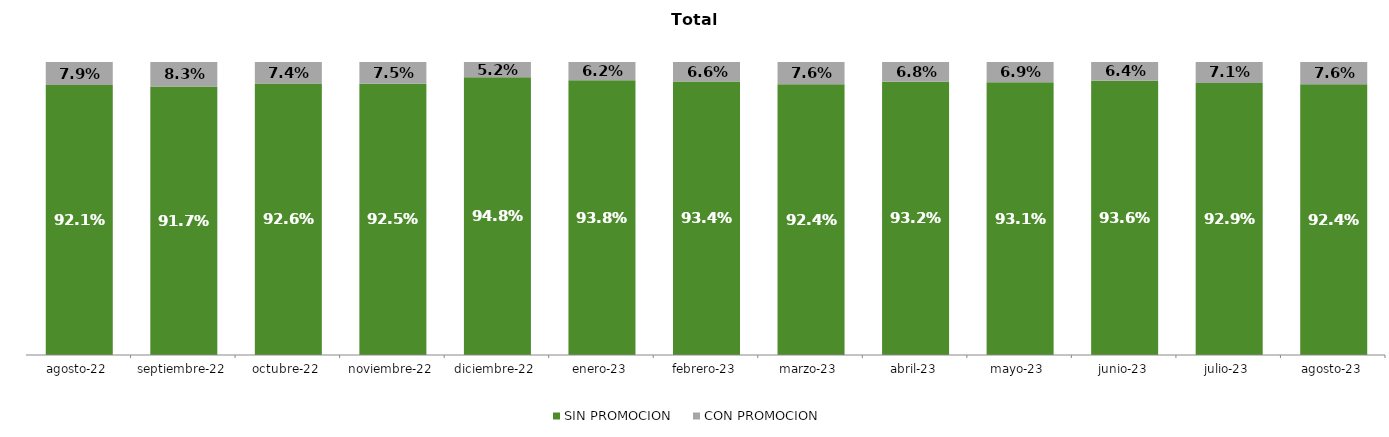
| Category | SIN PROMOCION   | CON PROMOCION   |
|---|---|---|
| 2022-08-01 | 0.921 | 0.079 |
| 2022-09-01 | 0.917 | 0.083 |
| 2022-10-01 | 0.926 | 0.074 |
| 2022-11-01 | 0.925 | 0.075 |
| 2022-12-01 | 0.948 | 0.052 |
| 2023-01-01 | 0.938 | 0.062 |
| 2023-02-01 | 0.934 | 0.066 |
| 2023-03-01 | 0.924 | 0.076 |
| 2023-04-01 | 0.932 | 0.068 |
| 2023-05-01 | 0.931 | 0.069 |
| 2023-06-01 | 0.936 | 0.064 |
| 2023-07-01 | 0.929 | 0.071 |
| 2023-08-01 | 0.924 | 0.076 |